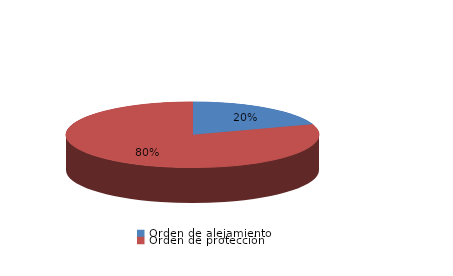
| Category | Series 0 |
|---|---|
| Orden de alejamiento | 17 |
| Orden de protección | 69 |